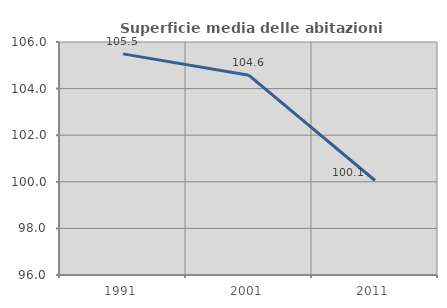
| Category | Superficie media delle abitazioni occupate |
|---|---|
| 1991.0 | 105.49 |
| 2001.0 | 104.571 |
| 2011.0 | 100.055 |